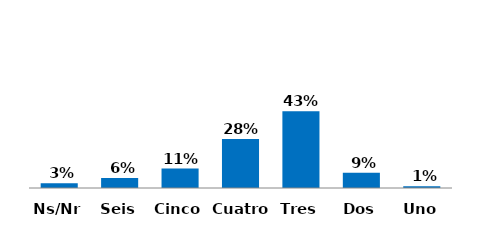
| Category | Series 0 |
|---|---|
| Uno | 0.01 |
| Dos | 0.087 |
| Tres | 0.433 |
| Cuatro | 0.277 |
| Cinco | 0.11 |
| Seis | 0.057 |
| Ns/Nr | 0.027 |